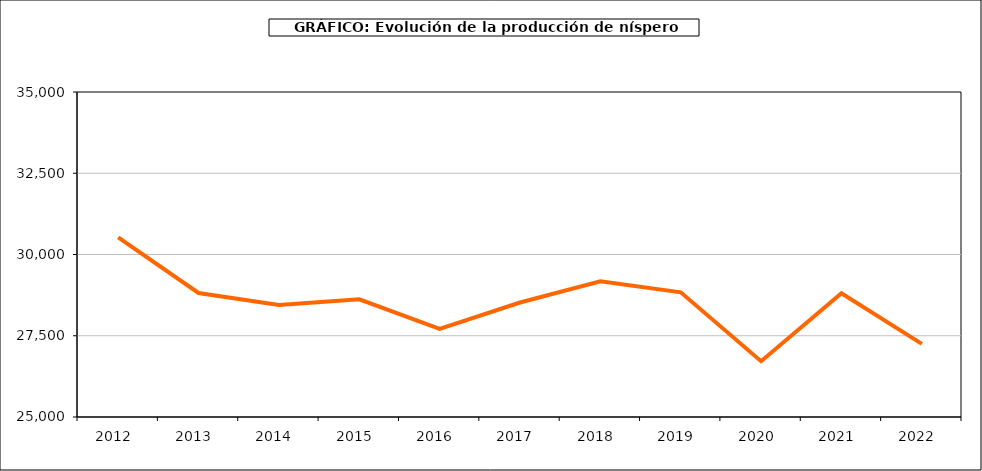
| Category | producción níspero |
|---|---|
| 2012.0 | 30529 |
| 2013.0 | 28815 |
| 2014.0 | 28449 |
| 2015.0 | 28620 |
| 2016.0 | 27712 |
| 2017.0 | 28522 |
| 2018.0 | 29173 |
| 2019.0 | 28836 |
| 2020.0 | 26717 |
| 2021.0 | 28805 |
| 2022.0 | 27249 |